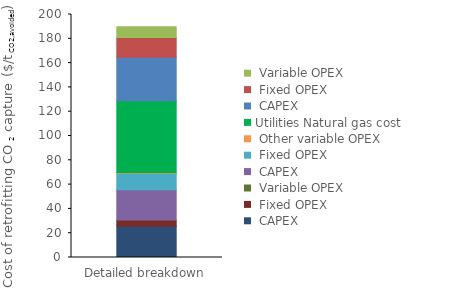
| Category | Interconnecting | Utilities | Series 0 | Series 1 | Series 2 |
|---|---|---|---|---|---|
| 0 | 0 | 59.326 | 35.677 | 16.344 | 8.707 |